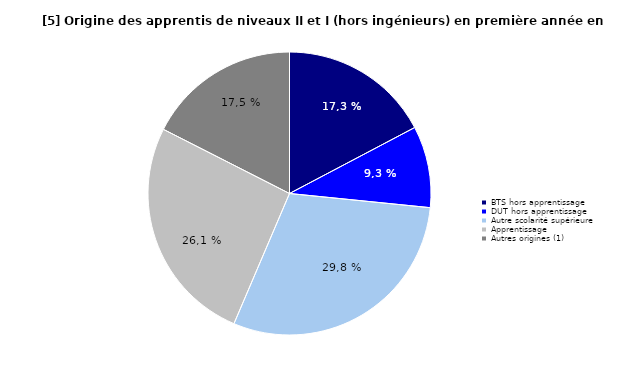
| Category | Series 0 | Series 1 |
|---|---|---|
| BTS hors apprentissage | 17.28 |  |
| DUT hors apprentissage | 9.32 |  |
| Autre scolarité supérieure | 29.82 |  |
| Apprentissage | 26.07 |  |
| Autres origines (1) | 17.51 |  |